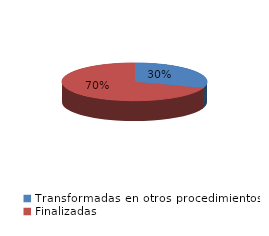
| Category | Series 0 |
|---|---|
| Transformadas en otros procedimientos | 1234 |
| Finalizadas | 2829 |